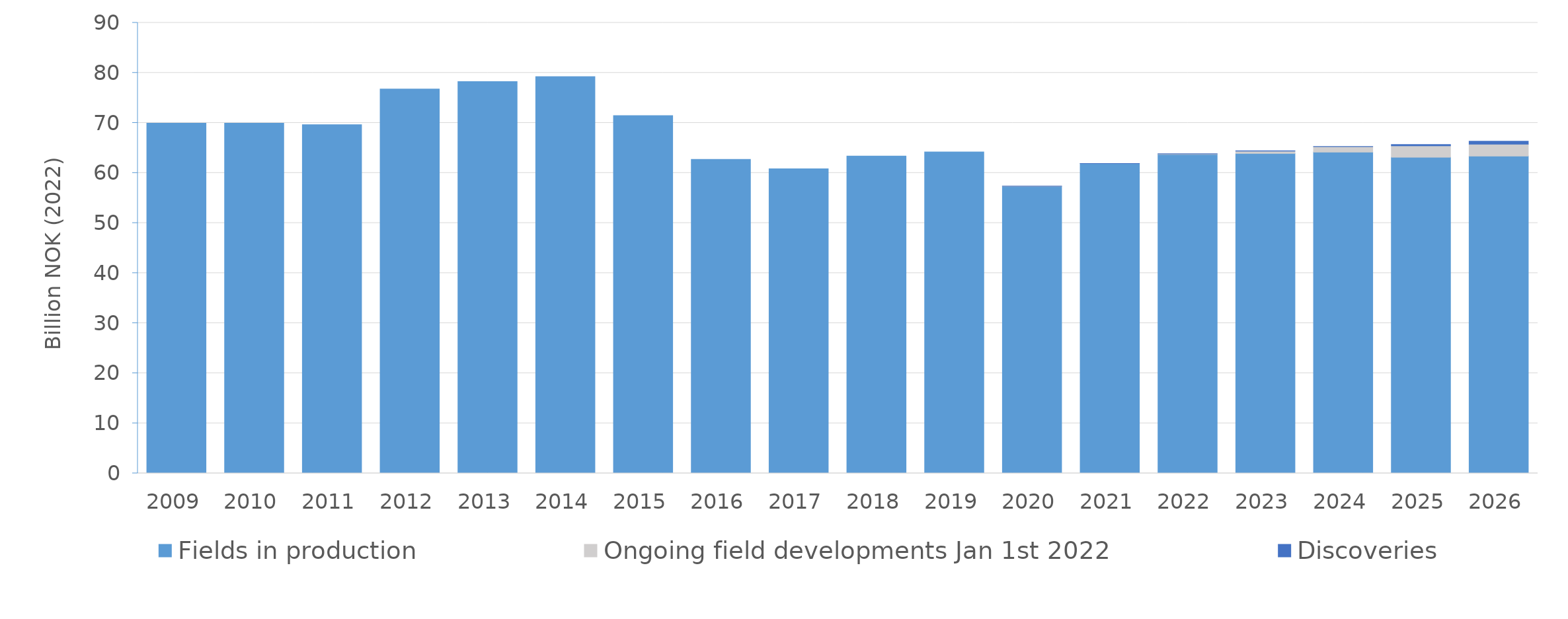
| Category | Fields in production | Ongoing field developments Jan 1st 2022 | Discoveries |
|---|---|---|---|
| 2009.0 | 69.956 | 0 | 0 |
| 2010.0 | 69.957 | 0 | 0 |
| 2011.0 | 69.653 | 0 | 0 |
| 2012.0 | 76.769 | 0 | 0 |
| 2013.0 | 78.264 | 0 | 0 |
| 2014.0 | 79.238 | 0 | 0 |
| 2015.0 | 71.458 | 0 | 0 |
| 2016.0 | 62.723 | 0 | 0 |
| 2017.0 | 60.837 | 0 | 0 |
| 2018.0 | 63.368 | 0 | 0 |
| 2019.0 | 64.204 | 0 | 0 |
| 2020.0 | 57.354 | 0.002 | 0.002 |
| 2021.0 | 61.882 | 0.002 | 0.017 |
| 2022.0 | 63.708 | 0.089 | 0.042 |
| 2023.0 | 63.912 | 0.462 | 0.042 |
| 2024.0 | 64.172 | 1.079 | 0.041 |
| 2025.0 | 63.132 | 2.286 | 0.271 |
| 2026.0 | 63.38 | 2.366 | 0.585 |